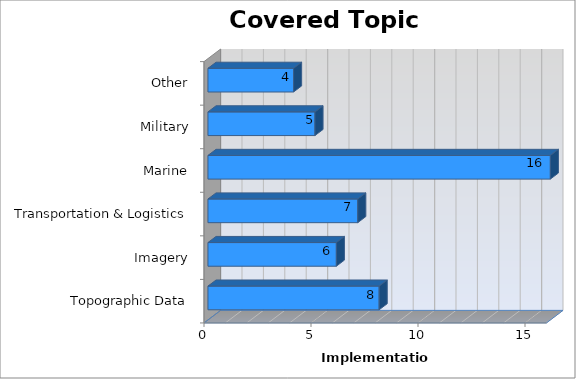
| Category | Series 0 |
|---|---|
| Topographic Data | 8 |
| Imagery | 6 |
| Transportation & Logistics | 7 |
| Marine | 16 |
| Military | 5 |
| Other | 4 |